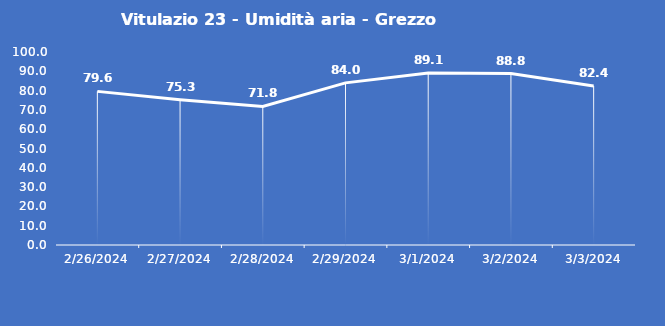
| Category | Vitulazio 23 - Umidità aria - Grezzo (%) |
|---|---|
| 2/26/24 | 79.6 |
| 2/27/24 | 75.3 |
| 2/28/24 | 71.8 |
| 2/29/24 | 84 |
| 3/1/24 | 89.1 |
| 3/2/24 | 88.8 |
| 3/3/24 | 82.4 |